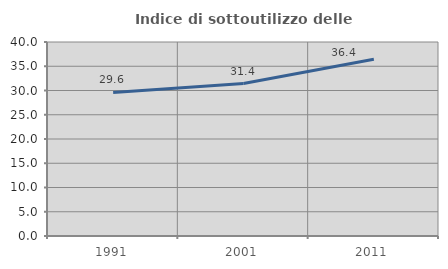
| Category | Indice di sottoutilizzo delle abitazioni  |
|---|---|
| 1991.0 | 29.608 |
| 2001.0 | 31.436 |
| 2011.0 | 36.425 |